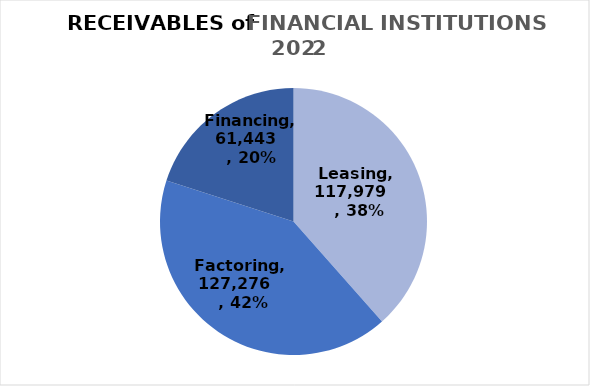
| Category | Series 0 |
|---|---|
| Leasing | 117979 |
| Factoring | 127276 |
| Financing | 61443 |